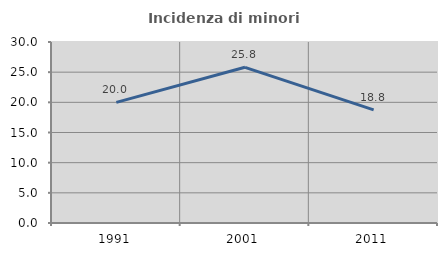
| Category | Incidenza di minori stranieri |
|---|---|
| 1991.0 | 20 |
| 2001.0 | 25.806 |
| 2011.0 | 18.75 |